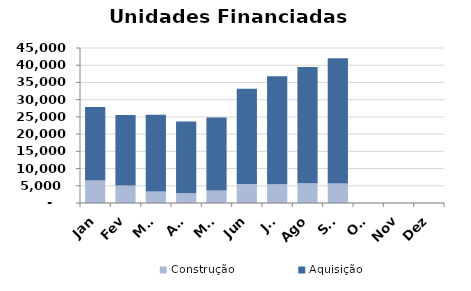
| Category | Construção | Aquisição  |
|---|---|---|
| Jan | 6521 | 21372 |
| Fev | 5079 | 20448 |
| Mar | 3354 | 22300 |
| Abr | 2813 | 20830 |
| Mai | 3650 | 21183 |
| Jun | 5496 | 27653 |
| Jul | 5439 | 31374 |
| Ago | 5744 | 33764 |
| Set | 5647 | 36388 |
| Out | 0 | 0 |
| Nov | 0 | 0 |
| Dez | 0 | 0 |